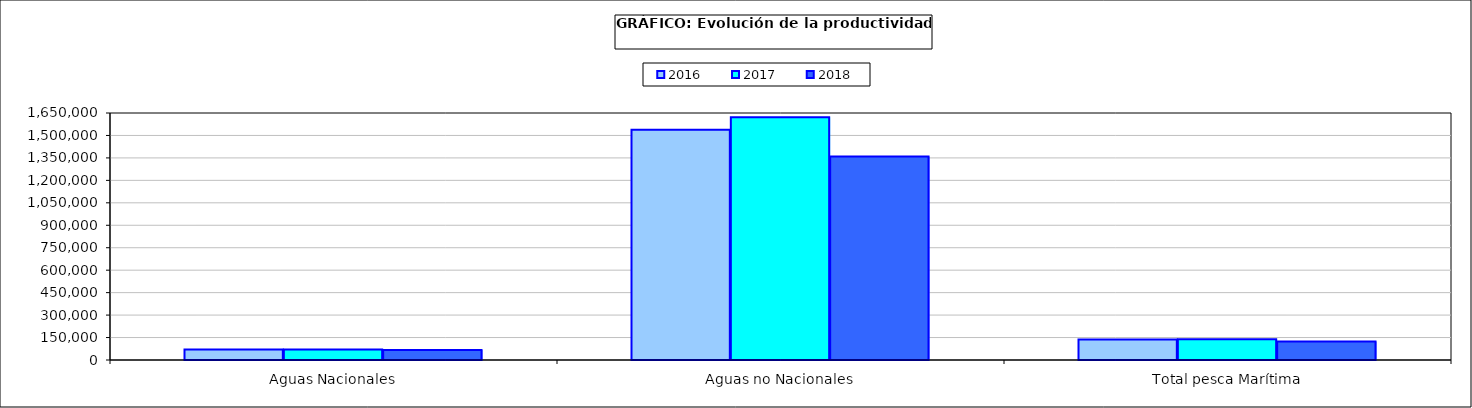
| Category | 2016 | 2017 | 2018 |
|---|---|---|---|
| 0 | 69511.518 | 70669.255 | 67571.06 |
| 1 | 1538868.762 | 1622080.15 | 1358789.456 |
| 2 | 136700.226 | 139309.134 | 124192.189 |